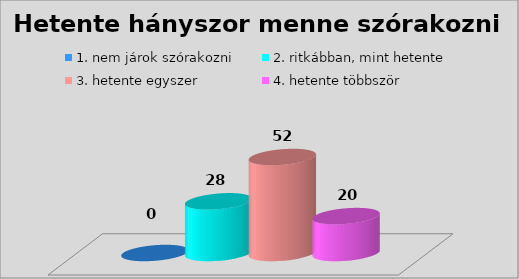
| Category | 1. nem járok szórakozni | 2. ritkábban, mint hetente | 3. hetente egyszer | 4. hetente többször |
|---|---|---|---|---|
| 0 | 0 | 28 | 52 | 20 |